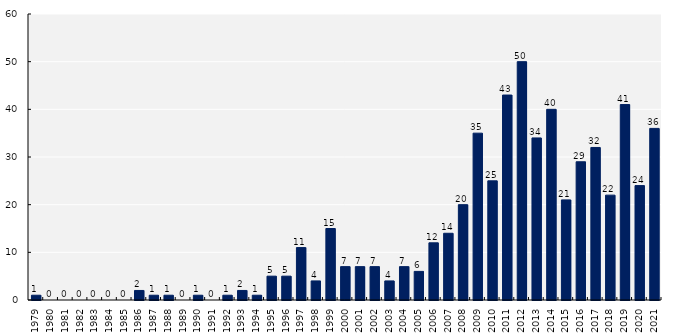
| Category | Number of processes |
|---|---|
| 1979.0 | 1 |
| 1980.0 | 0 |
| 1981.0 | 0 |
| 1982.0 | 0 |
| 1983.0 | 0 |
| 1984.0 | 0 |
| 1985.0 | 0 |
| 1986.0 | 2 |
| 1987.0 | 1 |
| 1988.0 | 1 |
| 1989.0 | 0 |
| 1990.0 | 1 |
| 1991.0 | 0 |
| 1992.0 | 1 |
| 1993.0 | 2 |
| 1994.0 | 1 |
| 1995.0 | 5 |
| 1996.0 | 5 |
| 1997.0 | 11 |
| 1998.0 | 4 |
| 1999.0 | 15 |
| 2000.0 | 7 |
| 2001.0 | 7 |
| 2002.0 | 7 |
| 2003.0 | 4 |
| 2004.0 | 7 |
| 2005.0 | 6 |
| 2006.0 | 12 |
| 2007.0 | 14 |
| 2008.0 | 20 |
| 2009.0 | 35 |
| 2010.0 | 25 |
| 2011.0 | 43 |
| 2012.0 | 50 |
| 2013.0 | 34 |
| 2014.0 | 40 |
| 2015.0 | 21 |
| 2016.0 | 29 |
| 2017.0 | 32 |
| 2018.0 | 22 |
| 2019.0 | 41 |
| 2020.0 | 24 |
| 2021.0 | 36 |